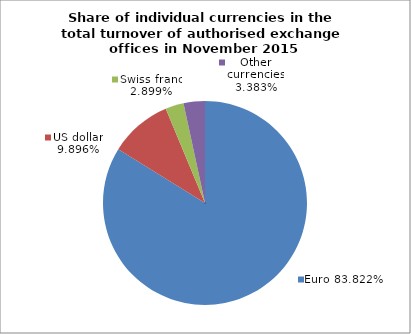
| Category | EUR |
|---|---|
| 0 | 0.838 |
| 1 | 0.099 |
| 2 | 0.029 |
| 3 | 0.034 |